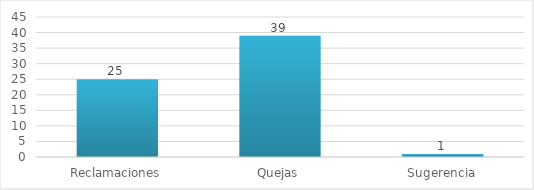
| Category | Series 0 |
|---|---|
| Reclamaciones | 25 |
| Quejas | 39 |
| Sugerencia | 1 |